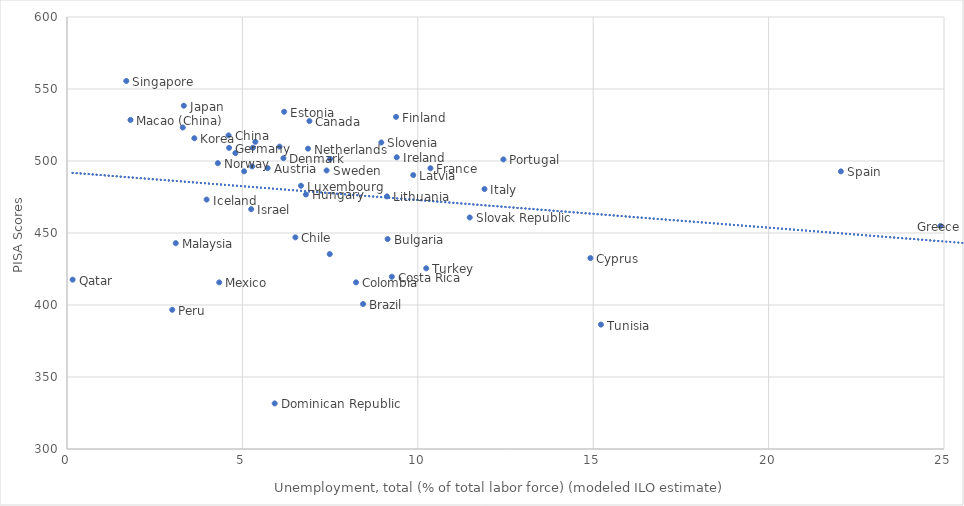
| Category | Series 0 |
|---|---|
| 6.05999994277954 | 509.994 |
| 5.71999979019165 | 495.037 |
| 8.4399995803833 | 400.682 |
| 9.14000034332275 | 445.772 |
| 6.90999984741211 | 527.705 |
| 6.51000022888184 | 446.956 |
| 4.60500001907349 | 517.779 |
| 8.23999977111816 | 415.729 |
| 9.26000022888184 | 419.608 |
| 14.9200000762939 | 432.577 |
| 5.05000019073486 | 492.83 |
| 6.17000007629395 | 501.937 |
| 5.92000007629395 | 331.639 |
| 6.19000005722046 | 534.194 |
| 9.38000011444092 | 530.661 |
| 10.3599996566772 | 494.978 |
| 4.61999988555908 | 509.141 |
| 24.8999996185303 | 454.829 |
| 3.29999995231628 | 523.277 |
| 6.80999994277954 | 476.748 |
| 3.98000001907349 | 473.23 |
| 9.39999961853027 | 502.575 |
| 5.25 | 466.553 |
| 11.8999996185303 | 480.547 |
| 3.32999992370605 | 538.395 |
| 3.63000011444092 | 515.81 |
| 9.86999988555908 | 490.225 |
| 9.11999988555908 | 475.409 |
| 6.67000007629395 | 482.806 |
| 1.80999994277954 | 528.55 |
| 3.09999990463257 | 442.948 |
| 4.34000015258789 | 415.71 |
| 6.86999988555908 | 508.575 |
| 5.36999988555908 | 513.304 |
| 4.30000019073486 | 498.481 |
| 3.0 | 396.684 |
| 7.5 | 501.435 |
| 12.4399995803833 | 501.1 |
| 0.159999996423721 | 417.611 |
| 1.69000005722046 | 555.575 |
| 11.4799995422363 | 460.775 |
| 8.96000003814697 | 512.864 |
| 22.0599994659424 | 492.786 |
| 7.40000009536743 | 493.422 |
| 4.80000019073486 | 505.506 |
| 15.2200002670288 | 386.403 |
| 10.2399997711182 | 425.49 |
| 5.30000019073486 | 509.222 |
| 5.28000020980835 | 496.242 |
| 7.48999977111816 | 435.363 |